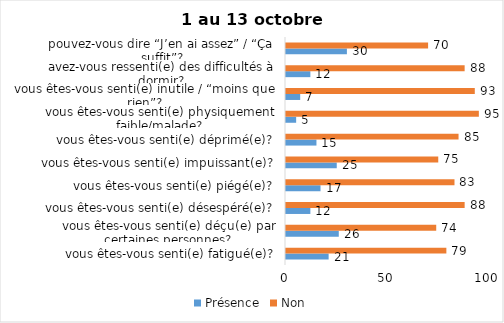
| Category | Présence | Non |
|---|---|---|
| vous êtes-vous senti(e) fatigué(e)? | 21 | 79 |
| vous êtes-vous senti(e) déçu(e) par certaines personnes? | 26 | 74 |
| vous êtes-vous senti(e) désespéré(e)? | 12 | 88 |
| vous êtes-vous senti(e) piégé(e)? | 17 | 83 |
| vous êtes-vous senti(e) impuissant(e)? | 25 | 75 |
| vous êtes-vous senti(e) déprimé(e)? | 15 | 85 |
| vous êtes-vous senti(e) physiquement faible/malade? | 5 | 95 |
| vous êtes-vous senti(e) inutile / “moins que rien”? | 7 | 93 |
| avez-vous ressenti(e) des difficultés à dormir? | 12 | 88 |
| pouvez-vous dire “J’en ai assez” / “Ça suffit”? | 30 | 70 |